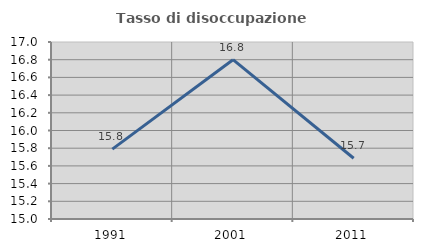
| Category | Tasso di disoccupazione giovanile  |
|---|---|
| 1991.0 | 15.789 |
| 2001.0 | 16.8 |
| 2011.0 | 15.686 |